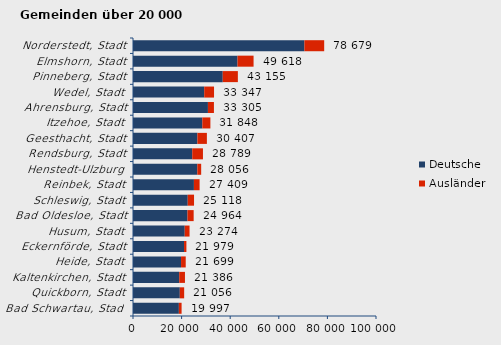
| Category | Deutsche | Ausländer | Series 2 |
|---|---|---|---|
| Bad Schwartau, Stadt | 18877 | 1120 | 19997 |
| Quickborn, Stadt | 19266 | 1790 | 21056 |
| Kaltenkirchen, Stadt | 19016 | 2370 | 21386 |
| Heide, Stadt | 19772 | 1927 | 21699 |
| Eckernförde, Stadt | 20999 | 980 | 21979 |
| Husum, Stadt | 21291 | 1983 | 23274 |
| Bad Oldesloe, Stadt | 22422 | 2542 | 24964 |
| Schleswig, Stadt | 22526 | 2592 | 25118 |
| Reinbek, Stadt | 25072 | 2337 | 27409 |
| Henstedt-Ulzburg | 26473 | 1583 | 28056 |
| Rendsburg, Stadt | 24379 | 4410 | 28789 |
| Geesthacht, Stadt | 26507 | 3900 | 30407 |
| Itzehoe, Stadt | 28525 | 3323 | 31848 |
| Ahrensburg, Stadt | 30838 | 2467 | 33305 |
| Wedel, Stadt | 29306 | 4041 | 33347 |
| Pinneberg, Stadt | 36932 | 6223 | 43155 |
| Elmshorn, Stadt | 43011 | 6607 | 49618 |
| Norderstedt, Stadt | 70532 | 8147 | 78679 |